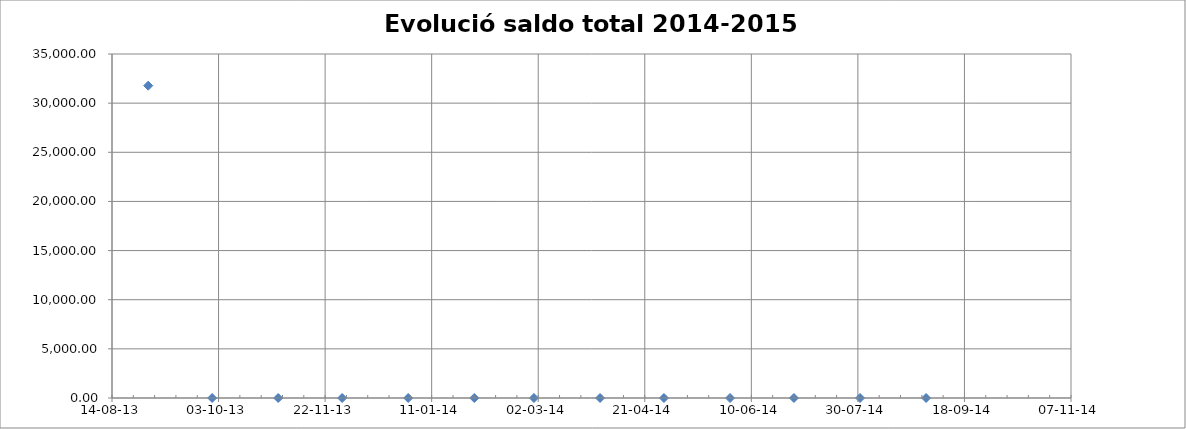
| Category | total € |
|---|---|
| 41517.0 | 31776.9 |
| 41547.0 | 0 |
| 41578.0 | 0 |
| 41608.0 | 0 |
| 41639.0 | 0 |
| 41670.0 | 0 |
| 41698.0 | 0 |
| 41729.0 | 0 |
| 41759.0 | 0 |
| 41790.0 | 0 |
| 41820.0 | 0 |
| 41851.0 | 0 |
| 41882.0 | 0 |